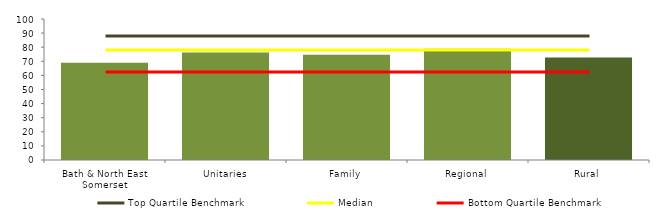
| Category | Block Data |
|---|---|
| Bath & North East Somerset | 69 |
| Unitaries | 76.273 |
| Family | 74.562 |
| Regional | 78.909 |
| Rural | 72.667 |